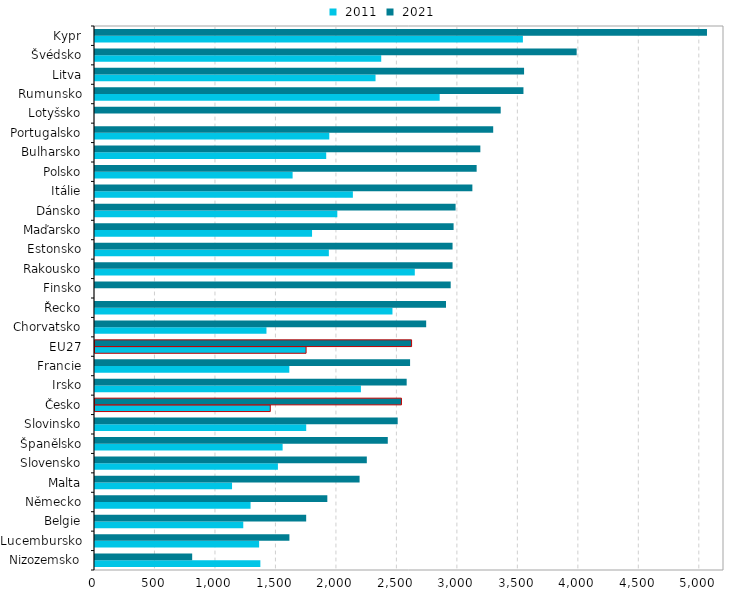
| Category |  2011 |  2021 |
|---|---|---|
| Nizozemsko | 1367.058 | 803.436 |
| Lucembursko | 1356.734 | 1607.199 |
| Belgie | 1225.787 | 1745.811 |
| Německo | 1285.994 | 1920.666 |
| Malta | 1132.94 | 2187.37 |
| Slovensko | 1512.157 | 2247.135 |
| Španělsko | 1551.096 | 2420.455 |
| Slovinsko | 1746.087 | 2502.409 |
| Česko | 1448.976 | 2533.412 |
| Irsko | 2198.343 | 2576.714 |
| Francie | 1606.349 | 2604.808 |
| EU27 | 1745.013 | 2617.256 |
| Chorvatsko | 1417.53 | 2737.892 |
| Řecko | 2459.126 | 2901.731 |
| Finsko | 0 | 2940.575 |
| Rakousko | 2643.818 | 2955.915 |
| Estonsko | 1933.317 | 2955.959 |
| Maďarsko | 1794.39 | 2964.503 |
| Dánsko | 2003.267 | 2981.043 |
| Itálie | 2131.878 | 3119.75 |
| Polsko | 1633.682 | 3155.134 |
| Bulharsko | 1911.438 | 3185.643 |
| Portugalsko | 1936.841 | 3291.964 |
| Lotyšsko | 0 | 3353.929 |
| Rumunsko | 2849.515 | 3542.064 |
| Litva | 2319.24 | 3547.14 |
| Švédsko | 2366.245 | 3981.863 |
| Kypr | 3537.403 | 5059.33 |